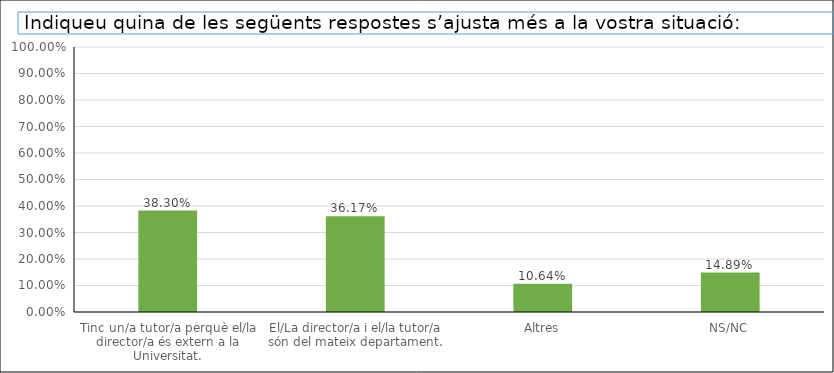
| Category | Series 0 |
|---|---|
| Tinc un/a tutor/a perquè el/la director/a és extern a la Universitat. | 0.383 |
| El/La director/a i el/la tutor/a són del mateix departament. | 0.362 |
| Altres | 0.106 |
| NS/NC | 0.149 |